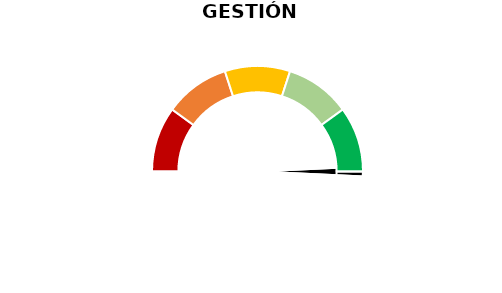
| Category | Puntero |
|---|---|
| 0 | 98.5 |
| 1 | 3 |
| 2 | 98.5 |